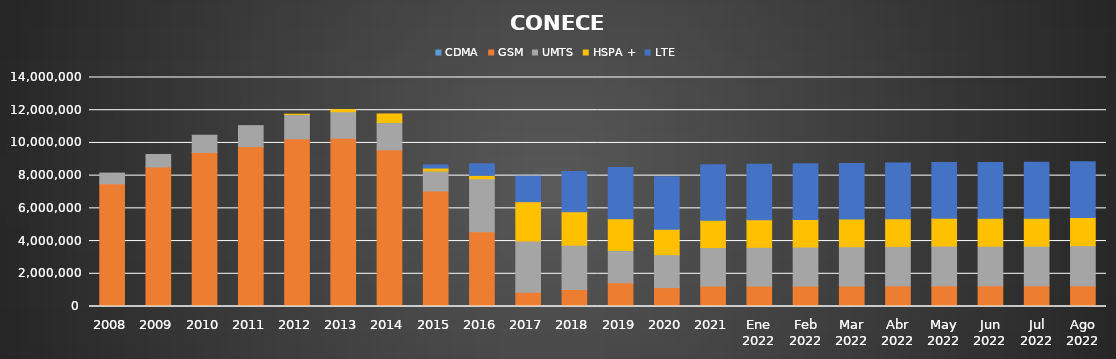
| Category | CDMA | GSM | UMTS | HSPA + | LTE |
|---|---|---|---|---|---|
| 2008 | 0 | 7499370 | 656989 | 0 | 0 |
| 2009 | 0 | 8532691 | 758577 | 0 | 0 |
| 2010 | 0 | 9419193 | 1051309 | 0 | 0 |
| 2011 | 0 | 9774865 | 1282451 | 0 | 0 |
| 2012 | 0 | 10252457 | 1484003 | 21446 | 0 |
| 2013 | 0 | 10287259 | 1622034 | 121593 | 0 |
| 2014 | 0 | 9581956 | 1664758 | 525306 | 0 |
| 2015 | 0 | 7065313 | 1214567 | 183109 | 195630 |
| 2016 | 0 | 4571999 | 3240700 | 201567 | 712557 |
| 2017 | 0 | 873346 | 3135577 | 2399460 | 1551880 |
| 2018 | 0 | 1039373 | 2706058 | 2049418 | 2453201 |
| 2019 | 0 | 1452334 | 1970422 | 1937931 | 3132367 |
| 2020 | 0 | 1158751 | 2009264 | 1548440 | 3212798 |
| 2021 | 0 | 1250925 | 2353798 | 1675346 | 3385646 |
| Ene 2022 | 0 | 1253803 | 2367204 | 1682872 | 3391452 |
| Feb 2022 | 0 | 1256245 | 2379435 | 1688963 | 3397299 |
| Mar 2022 | 0 | 1259631 | 2392596 | 1693034 | 3401696 |
| Abr 2022 | 0 | 1264438 | 2406911 | 1697322 | 3404685 |
| May 2022 | 0 | 1270140 | 2426173 | 1703122 | 3410983 |
| Jun 2022 | 0 | 1262085 | 2423097 | 1704279 | 3412930 |
| Jul 2022 | 0 | 1263792 | 2429301 | 1706746 | 3411593 |
| Ago 2022 | 0 | 1267014 | 2455439 | 1715007 | 3418449 |